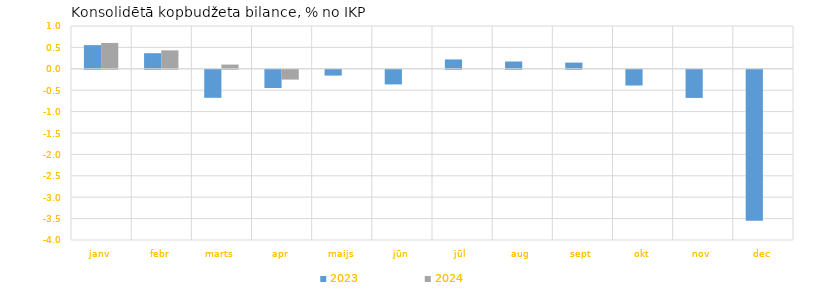
| Category | 2023 | 2024 |
|---|---|---|
| janv | 0.553 | 0.604 |
| febr | 0.365 | 0.431 |
| marts | -0.654 | 0.099 |
| apr | -0.426 | -0.229 |
| maijs | -0.136 | 0 |
| jūn | -0.341 | 0 |
| jūl | 0.219 | 0 |
| aug | 0.171 | 0 |
| sept | 0.145 | 0 |
| okt | -0.367 | 0 |
| nov | -0.657 | 0 |
| dec | -3.527 | 0 |